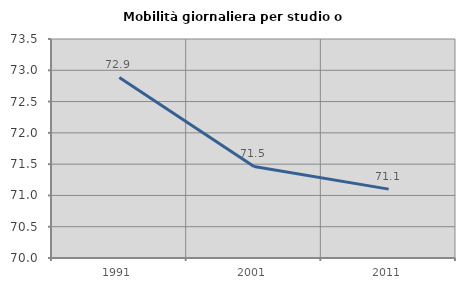
| Category | Mobilità giornaliera per studio o lavoro |
|---|---|
| 1991.0 | 72.886 |
| 2001.0 | 71.463 |
| 2011.0 | 71.101 |